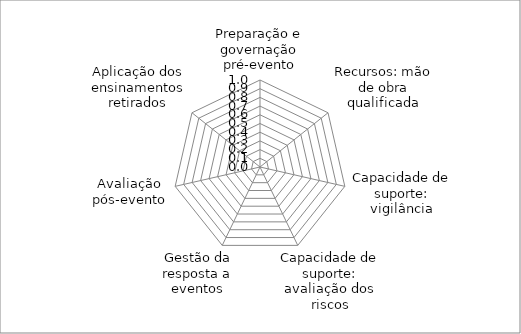
| Category | Series 0 |
|---|---|
| Preparação e governação pré-evento | 0 |
| Recursos: mão de obra qualificada | 0 |
| Capacidade de suporte: vigilância | 0 |
| Capacidade de suporte: avaliação dos riscos | 0 |
| Gestão da resposta a eventos | 0 |
| Avaliação pós-evento | 0 |
| Aplicação dos ensinamentos retirados | 0 |